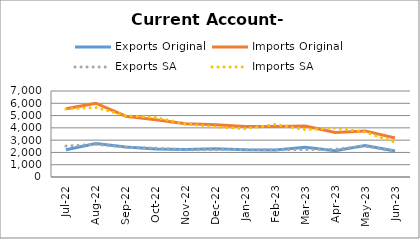
| Category | Exports Original | Imports Original | Exports SA | Imports SA |
|---|---|---|---|---|
| 2022-07-01 | 2215 | 5562 | 2521 | 5540 |
| 2022-08-01 | 2734 | 6007 | 2656 | 5657 |
| 2022-09-01 | 2438 | 4951 | 2419 | 4987 |
| 2022-10-01 | 2281 | 4657 | 2357 | 4848 |
| 2022-11-01 | 2246 | 4340 | 2208 | 4320 |
| 2022-12-01 | 2308 | 4256 | 2224 | 4073 |
| 2023-01-01 | 2222 | 4109 | 2234 | 3931 |
| 2023-02-01 | 2199 | 4104 | 2212 | 4278 |
| 2023-03-01 | 2422 | 4158 | 2235 | 3853 |
| 2023-04-01 | 2135 | 3622 | 2259 | 3981 |
| 2023-05-01 | 2565 | 3752 | 2507 | 3664 |
| 2023-06-01 | 2111 | 3177 | 2079 | 2823 |